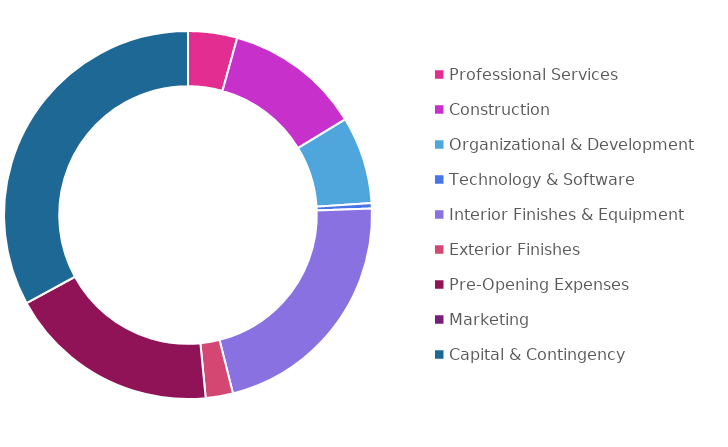
| Category | Series 0 | Series 1 | Series 2 |
|---|---|---|---|
| Professional Services |  |  | 3600 |
| Construction |  |  | 10000 |
| Organizational & Development |  |  | 6400 |
| Technology & Software |  |  | 390 |
| Interior Finishes & Equipment |  |  | 18050 |
| Exterior Finishes |  |  | 2000 |
| Pre-Opening Expenses |  |  | 15500 |
| Marketing |  |  | 0 |
| Capital & Contingency |  |  | 27500 |